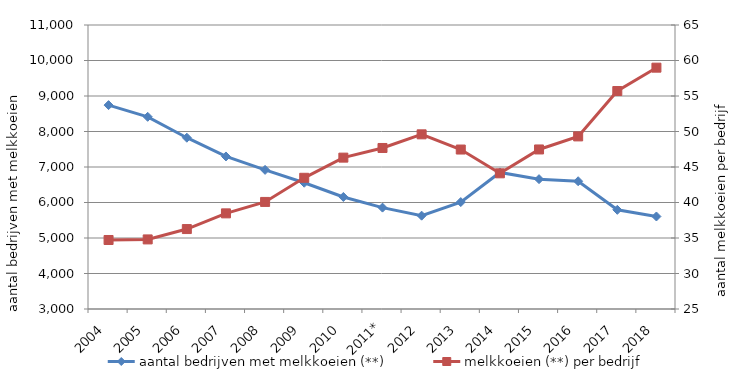
| Category | aantal bedrijven met melkkoeien (**) |
|---|---|
| 2004 | 8743 |
| 2005 | 8414 |
| 2006 | 7825 |
| 2007 | 7297 |
| 2008 | 6919 |
| 2009 | 6557 |
| 2010 | 6156 |
| 2011* | 5856 |
| 2012 | 5629 |
| 2013 | 6012 |
| 2014 | 6847 |
| 2015 | 6658 |
| 2016 | 6599 |
| 2017 | 5794 |
| 2018 | 5606 |